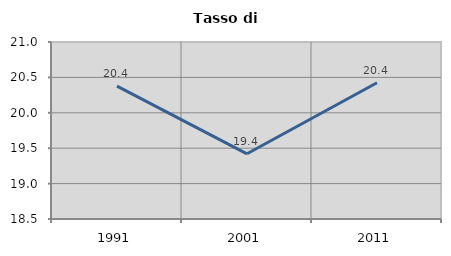
| Category | Tasso di disoccupazione   |
|---|---|
| 1991.0 | 20.376 |
| 2001.0 | 19.421 |
| 2011.0 | 20.424 |